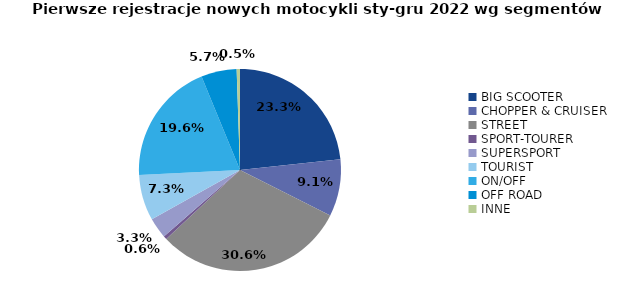
| Category | Series 0 |
|---|---|
| 0 | 5574 |
| 1 | 2177 |
| 2 | 7320 |
| 3 | 132 |
| 4 | 789 |
| 5 | 1756 |
| 6 | 4676 |
| 7 | 1359 |
| 8 | 127 |